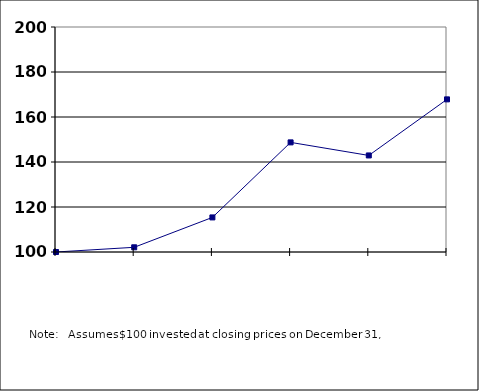
| Category |  100.00  |
|---|---|
| nan | 100 |
| 2012.0 | 102.09 |
| 2013.0 | 115.369 |
| 2014.0 | 148.722 |
| 2015.0 | 142.915 |
| 2016.0 | 167.84 |